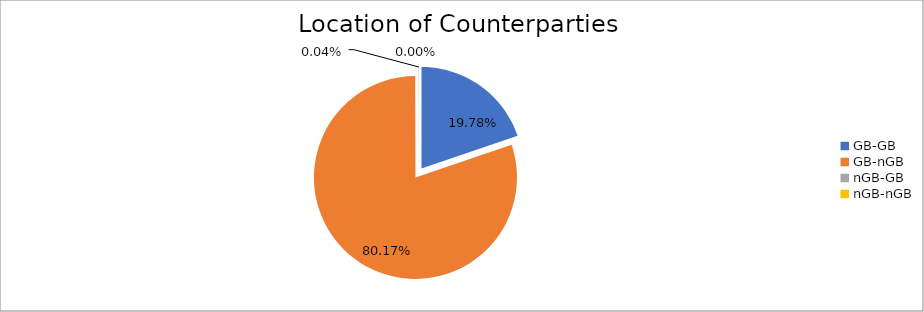
| Category | Series 0 |
|---|---|
| GB-GB | 1868244.82 |
| GB-nGB | 7571843.307 |
| nGB-GB | 4172.671 |
| nGB-nGB | 396.766 |